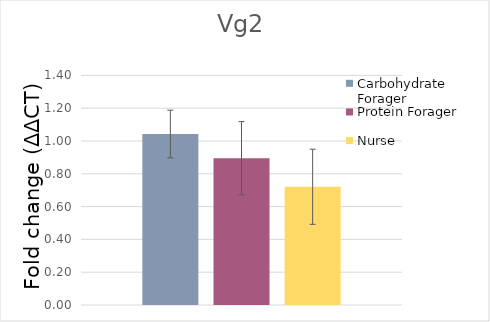
| Category | Carbohydrate Forager | Protein Forager | Nurse |
|---|---|---|---|
| Vg2 | 1.042 | 0.895 | 0.721 |